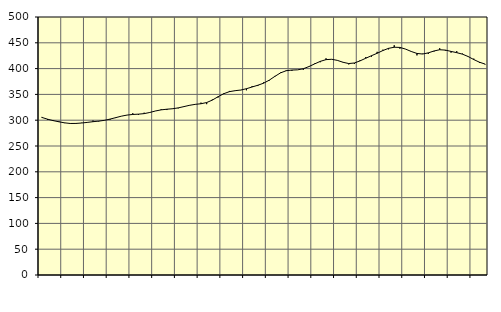
| Category | Piggar | Series 1 |
|---|---|---|
| nan | 306.3 | 305.4 |
| 1.0 | 300.5 | 301.99 |
| 1.0 | 300.4 | 299.18 |
| 1.0 | 298.2 | 296.88 |
| nan | 294.4 | 294.9 |
| 2.0 | 293 | 293.65 |
| 2.0 | 293.3 | 293.74 |
| 2.0 | 295 | 294.57 |
| nan | 295.3 | 295.75 |
| 3.0 | 299.3 | 297.11 |
| 3.0 | 297.4 | 298.19 |
| 3.0 | 299.4 | 299.73 |
| nan | 300.9 | 302.13 |
| 4.0 | 304.2 | 304.96 |
| 4.0 | 307.7 | 307.83 |
| 4.0 | 309.9 | 309.94 |
| nan | 313.5 | 311.13 |
| 5.0 | 310.3 | 311.72 |
| 5.0 | 314.5 | 312.72 |
| 5.0 | 315.2 | 315.01 |
| nan | 318 | 317.89 |
| 6.0 | 321.3 | 320.06 |
| 6.0 | 319.7 | 321.3 |
| 6.0 | 322.6 | 322.2 |
| nan | 323 | 323.87 |
| 7.0 | 326.8 | 326.35 |
| 7.0 | 329.3 | 328.91 |
| 7.0 | 330.4 | 330.71 |
| nan | 334 | 331.9 |
| 8.0 | 331.1 | 334.23 |
| 8.0 | 340.1 | 338.99 |
| 8.0 | 343.9 | 345.5 |
| nan | 352.2 | 351.3 |
| 9.0 | 356.7 | 355.33 |
| 9.0 | 357.3 | 357.17 |
| 9.0 | 358.2 | 358.48 |
| nan | 358 | 361.03 |
| 10.0 | 366 | 364.38 |
| 10.0 | 366.2 | 367.71 |
| 10.0 | 373.2 | 371.66 |
| nan | 376.5 | 377.5 |
| 11.0 | 385.8 | 384.92 |
| 11.0 | 392.4 | 391.72 |
| 11.0 | 396.8 | 395.91 |
| nan | 395.7 | 397.19 |
| 12.0 | 397.5 | 397.61 |
| 12.0 | 397.8 | 399.7 |
| 12.0 | 403.6 | 403.96 |
| nan | 409.9 | 409.13 |
| 13.0 | 412.4 | 414.06 |
| 13.0 | 419.9 | 417.37 |
| 13.0 | 418.3 | 418.06 |
| nan | 415.6 | 415.92 |
| 14.0 | 412.5 | 412.24 |
| 14.0 | 408.1 | 409.79 |
| 14.0 | 409 | 410.89 |
| nan | 416.4 | 415.04 |
| 15.0 | 422.3 | 420.1 |
| 15.0 | 423.1 | 425.02 |
| 15.0 | 432.5 | 429.71 |
| nan | 436.6 | 434.98 |
| 16.0 | 437.3 | 439.24 |
| 16.0 | 445.2 | 441.4 |
| 16.0 | 438.6 | 441.04 |
| nan | 437.9 | 437.78 |
| 17.0 | 432.7 | 433.14 |
| 17.0 | 425.6 | 429.37 |
| 17.0 | 428.9 | 428.26 |
| nan | 428.5 | 430.51 |
| 18.0 | 433.2 | 434.16 |
| 18.0 | 439.5 | 436.56 |
| 18.0 | 434.7 | 435.84 |
| nan | 430.9 | 433.31 |
| 19.0 | 433.8 | 430.89 |
| 19.0 | 429.1 | 428.02 |
| 19.0 | 423.9 | 423.44 |
| nan | 419.3 | 417.49 |
| 20.0 | 410.9 | 412.34 |
| 20.0 | 408 | 408.7 |